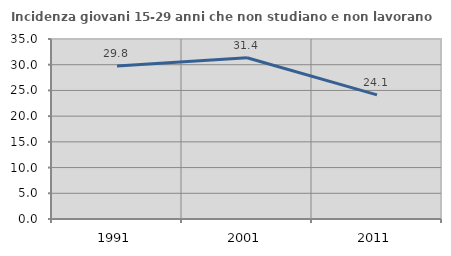
| Category | Incidenza giovani 15-29 anni che non studiano e non lavorano  |
|---|---|
| 1991.0 | 29.765 |
| 2001.0 | 31.35 |
| 2011.0 | 24.138 |